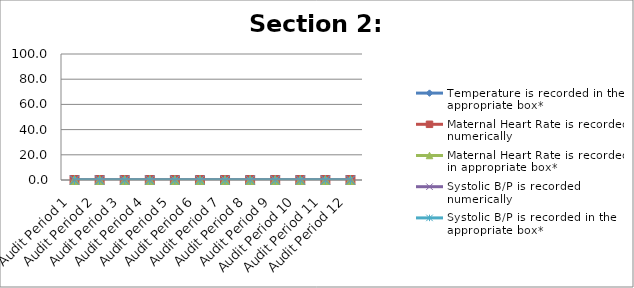
| Category | Temperature is recorded in the appropriate box* | Maternal Heart Rate is recorded numerically | Maternal Heart Rate is recorded in appropriate box*  | Systolic B/P is recorded numerically | Systolic B/P is recorded in the appropriate box*  |
|---|---|---|---|---|---|
| Audit Period 1 | 0 | 0 | 0 | 0 | 0 |
| Audit Period 2 | 0 | 0 | 0 | 0 | 0 |
| Audit Period 3 | 0 | 0 | 0 | 0 | 0 |
| Audit Period 4 | 0 | 0 | 0 | 0 | 0 |
| Audit Period 5 | 0 | 0 | 0 | 0 | 0 |
| Audit Period 6 | 0 | 0 | 0 | 0 | 0 |
| Audit Period 7 | 0 | 0 | 0 | 0 | 0 |
| Audit Period 8 | 0 | 0 | 0 | 0 | 0 |
| Audit Period 9 | 0 | 0 | 0 | 0 | 0 |
| Audit Period 10 | 0 | 0 | 0 | 0 | 0 |
| Audit Period 11 | 0 | 0 | 0 | 0 | 0 |
| Audit Period 12 | 0 | 0 | 0 | 0 | 0 |